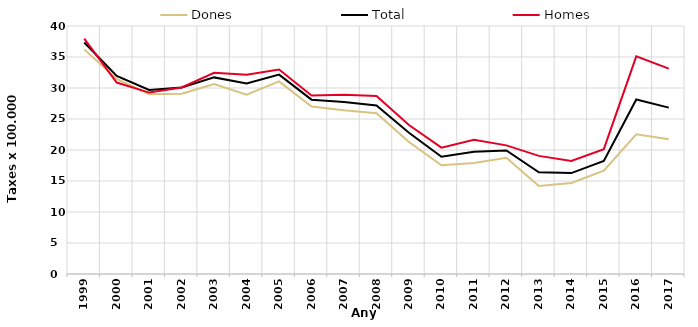
| Category | Dones | Total | Homes |
|---|---|---|---|
| 1999.0 | 36.23 | 37.34 | 37.97 |
| 2000.0 | 31.47 | 31.93 | 30.88 |
| 2001.0 | 29.01 | 29.69 | 29.26 |
| 2002.0 | 29.07 | 30.09 | 30.09 |
| 2003.0 | 30.63 | 31.71 | 32.46 |
| 2004.0 | 28.91 | 30.74 | 32.15 |
| 2005.0 | 31.06 | 32.16 | 32.98 |
| 2006.0 | 27.01 | 28.12 | 28.8 |
| 2007.0 | 26.4 | 27.75 | 28.91 |
| 2008.0 | 25.93 | 27.19 | 28.71 |
| 2009.0 | 21.29 | 22.78 | 24.03 |
| 2010.0 | 17.55 | 18.92 | 20.38 |
| 2011.0 | 17.92 | 19.73 | 21.65 |
| 2012.0 | 18.74 | 19.93 | 20.75 |
| 2013.0 | 14.19 | 16.41 | 19.05 |
| 2014.0 | 14.67 | 16.28 | 18.23 |
| 2015.0 | 16.67 | 18.25 | 20.13 |
| 2016.0 | 22.52 | 28.15 | 35.11 |
| 2017.0 | 21.72 | 26.83 | 33.12 |